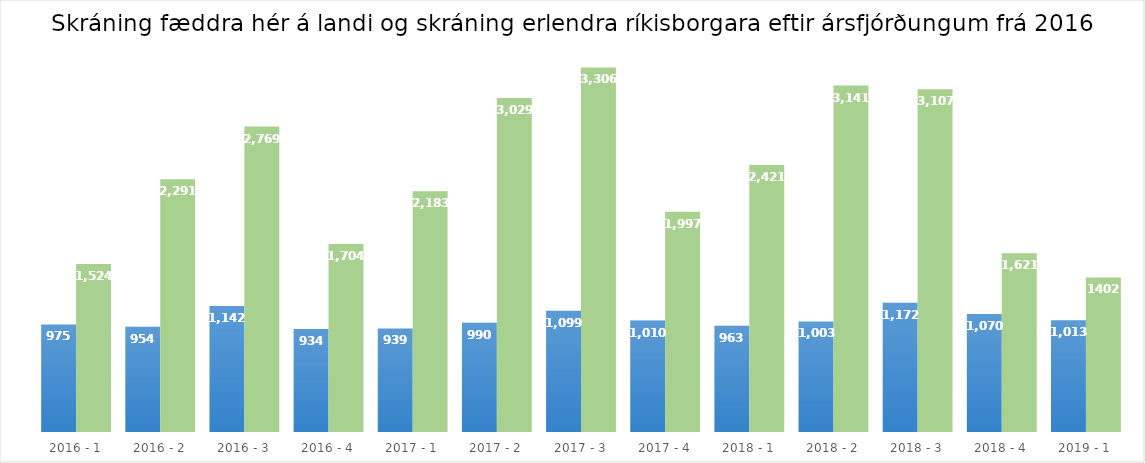
| Category | Skráning fæddra | Skráning erlendra |
|---|---|---|
| 2016 - 1 | 975 | 1524 |
| 2016 - 2 | 954 | 2291 |
| 2016 - 3 | 1142 | 2769 |
| 2016 - 4 | 934 | 1704 |
| 2017 - 1 | 939 | 2183 |
| 2017 - 2 | 990 | 3029 |
| 2017 - 3 | 1099 | 3306 |
| 2017 - 4 | 1010 | 1997 |
| 2018 - 1 | 963 | 2421 |
| 2018 - 2 | 1003 | 3141 |
| 2018 - 3 | 1172 | 3107 |
| 2018 - 4 | 1070 | 1621 |
| 2019 - 1 | 1013 | 1402 |